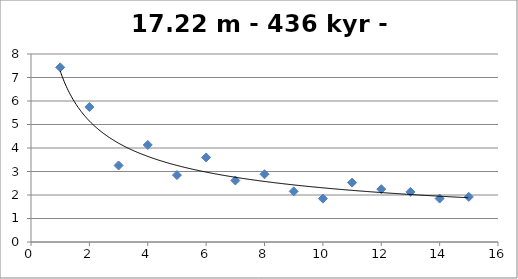
| Category | Series 0 |
|---|---|
| 1.0 | 7.433 |
| 2.0 | 5.745 |
| 3.0 | 3.256 |
| 4.0 | 4.129 |
| 5.0 | 2.846 |
| 6.0 | 3.598 |
| 7.0 | 2.617 |
| 8.0 | 2.883 |
| 9.0 | 2.155 |
| 10.0 | 1.847 |
| 11.0 | 2.526 |
| 12.0 | 2.248 |
| 13.0 | 2.131 |
| 14.0 | 1.849 |
| 15.0 | 1.92 |